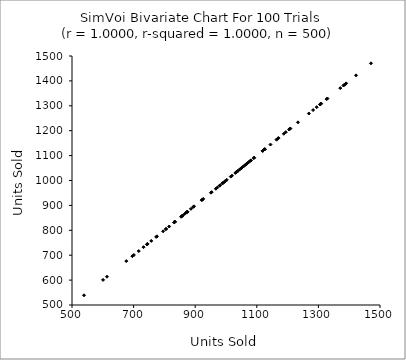
| Category | Series 0 |
|---|---|
| 854.2304992150957 | 854.23 |
| 1169.8612101544886 | 1169.861 |
| 1371.0105038075726 | 1371.011 |
| 1079.3100416607313 | 1079.31 |
| 1282.8143712501453 | 1282.814 |
| 1059.6817778812351 | 1059.682 |
| 1124.5207805124694 | 1124.521 |
| 1422.243596117321 | 1422.244 |
| 805.4286285431208 | 805.429 |
| 834.7279760569274 | 834.728 |
| 1163.9249930490264 | 1163.925 |
| 953.4724346896035 | 953.472 |
| 1002.3863059291955 | 1002.386 |
| 832.46673787131 | 832.467 |
| 971.4091549471574 | 971.409 |
| 676.3192585275103 | 676.319 |
| 700.8362677956435 | 700.836 |
| 992.2861438405348 | 992.286 |
| 1208.8526924818707 | 1208.853 |
| 757.3443138062273 | 757.344 |
| 1015.6611762761873 | 1015.661 |
| 1125.6151042472584 | 1125.615 |
| 1069.8917819320027 | 1069.892 |
| 832.4779355059433 | 832.478 |
| 743.4577781368981 | 743.458 |
| 926.0074625134736 | 926.007 |
| 832.6524019448946 | 832.652 |
| 1048.4379801212203 | 1048.438 |
| 1030.2035865437097 | 1030.204 |
| 1269.0459592912462 | 1269.046 |
| 1207.3383528489242 | 1207.338 |
| 1167.419868229228 | 1167.42 |
| 1307.7569829173165 | 1307.757 |
| 1125.902538398584 | 1125.903 |
| 1144.346987670863 | 1144.347 |
| 1038.9570459175025 | 1038.957 |
| 600.8797298106829 | 600.88 |
| 874.603444996067 | 874.603 |
| 804.8306583039259 | 804.831 |
| 732.2427400086109 | 732.243 |
| 990.2341857814116 | 990.234 |
| 867.0982547768922 | 867.098 |
| 1470.633751757023 | 1470.634 |
| 1233.5875804751317 | 1233.588 |
| 696.0218862822708 | 696.022 |
| 922.4155705003785 | 922.416 |
| 1294.5048946550708 | 1294.505 |
| 1119.1458730094935 | 1119.146 |
| 871.6810285204074 | 871.681 |
| 538.9908018000363 | 538.991 |
| 1090.0064026605994 | 1090.006 |
| 1381.4380059949115 | 1381.438 |
| 1034.4274075580267 | 1034.427 |
| 886.1509308388434 | 886.151 |
| 951.0627538148608 | 951.063 |
| 997.1800475709239 | 997.18 |
| 613.5506962878214 | 613.551 |
| 893.3244129630722 | 893.324 |
| 979.2113113560837 | 979.211 |
| 1187.6953989895499 | 1187.695 |
| 745.3334934036423 | 745.333 |
| 1033.2367039437734 | 1033.237 |
| 966.9189485038161 | 966.919 |
| 1204.8465738497155 | 1204.847 |
| 1308.8626778755079 | 1308.863 |
| 1388.136836670917 | 1388.137 |
| 831.9991147940208 | 831.999 |
| 773.3525200595174 | 773.353 |
| 1119.056043201873 | 1119.056 |
| 896.2870831988334 | 896.287 |
| 980.6104859028452 | 980.61 |
| 775.6312556755869 | 775.631 |
| 744.2718811806145 | 744.272 |
| 1329.3307403705946 | 1329.331 |
| 988.2144326386576 | 988.214 |
| 1043.8988304091743 | 1043.899 |
| 815.30414517674 | 815.304 |
| 1073.694357936928 | 1073.694 |
| 859.8738140657605 | 859.874 |
| 1051.3923178232073 | 1051.392 |
| 1305.4874969343787 | 1305.487 |
| 856.3551125800636 | 856.355 |
| 716.7415929467866 | 716.742 |
| 1019.4637411597444 | 1019.464 |
| 1326.6852542907861 | 1326.685 |
| 1390.1126832711989 | 1390.113 |
| 921.2321974917412 | 921.232 |
| 1091.6443304564064 | 1091.644 |
| 1080.9036500692785 | 1080.904 |
| 795.8772844647125 | 795.877 |
| 1385.0025651443389 | 1385.003 |
| 1305.7105710319795 | 1305.711 |
| 857.5931844233969 | 857.593 |
| 873.9411724435046 | 873.941 |
| 1194.1909050114357 | 1194.191 |
| 1067.4961717098668 | 1067.496 |
| 1170.0797885633278 | 1170.08 |
| 873.6827009415773 | 873.683 |
| 1056.208619638397 | 1056.209 |
| 1064.546339232998 | 1064.546 |